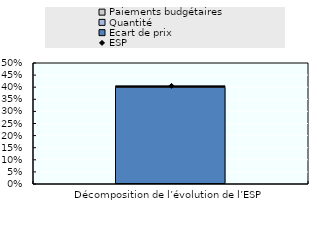
| Category | Ecart de prix | Quantité | Paiements budgétaires |
|---|---|---|---|
| Décomposition de l’évolution de l’ESP | 0.4 | 0.001 | 0.005 |